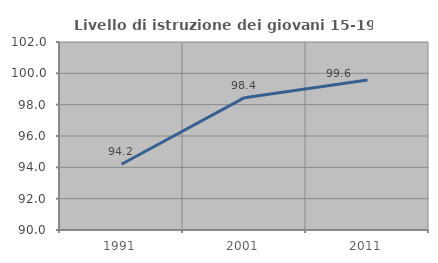
| Category | Livello di istruzione dei giovani 15-19 anni |
|---|---|
| 1991.0 | 94.2 |
| 2001.0 | 98.448 |
| 2011.0 | 99.574 |